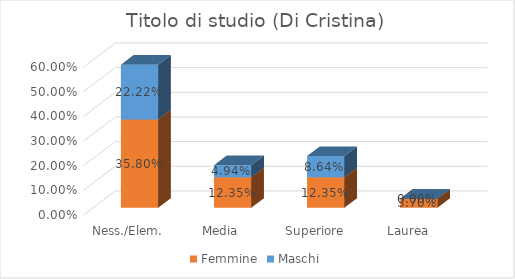
| Category | Femmine | Maschi |
|---|---|---|
| Ness./Elem. | 0.358 | 0.222 |
| Media | 0.123 | 0.049 |
| Superiore | 0.123 | 0.086 |
| Laurea | 0.037 | 0 |